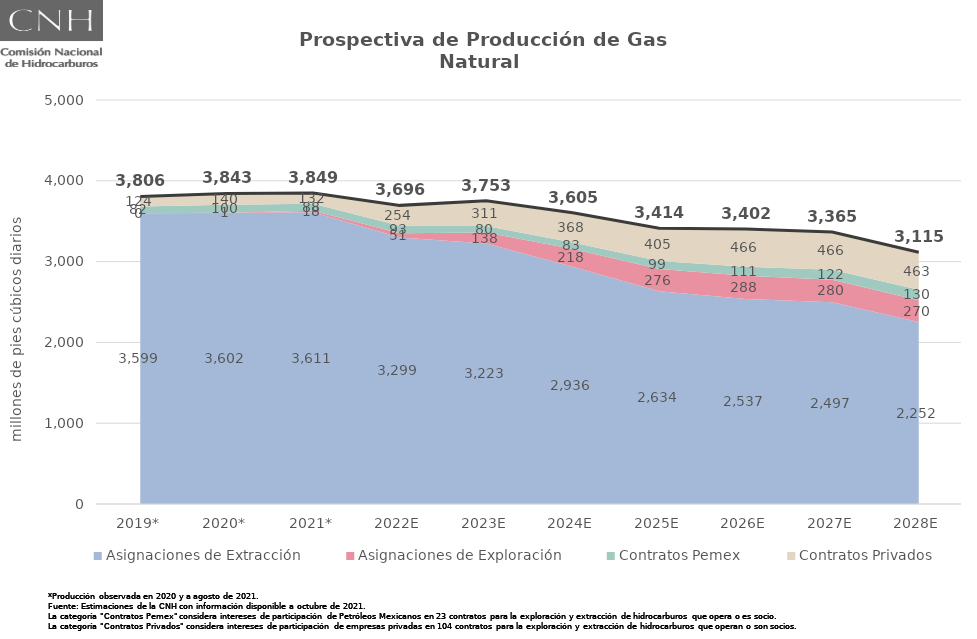
| Category | Total |
|---|---|
| 2019* | 3805.803 |
| 2020* | 3843.294 |
| 2021* | 3849.199 |
| 2022E | 3695.897 |
| 2023E | 3752.533 |
| 2024E | 3605.114 |
| 2025E | 3414.018 |
| 2026E | 3401.955 |
| 2027E | 3365.437 |
| 2028E | 3114.746 |